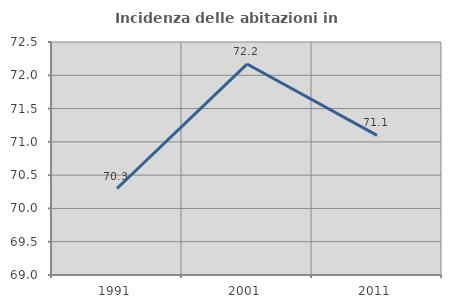
| Category | Incidenza delle abitazioni in proprietà  |
|---|---|
| 1991.0 | 70.299 |
| 2001.0 | 72.169 |
| 2011.0 | 71.097 |